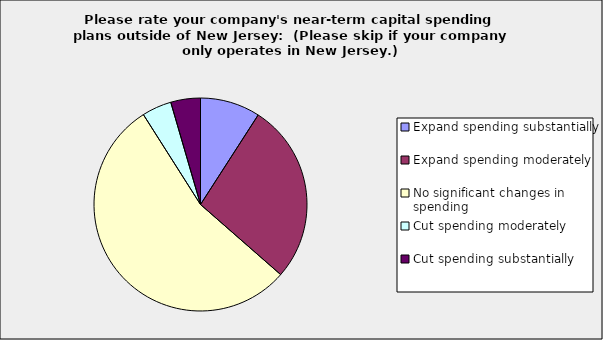
| Category | Series 0 |
|---|---|
| Expand spending substantially | 0.091 |
| Expand spending moderately | 0.273 |
| No significant changes in spending | 0.545 |
| Cut spending moderately | 0.045 |
| Cut spending substantially | 0.045 |